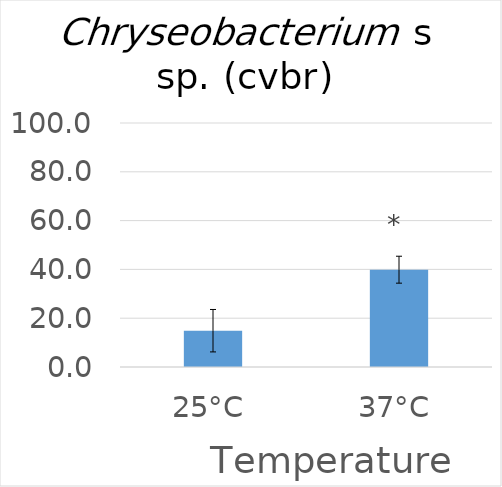
| Category | Series 0 |
|---|---|
| 25°C | 14.88 |
| 37°C | 39.88 |